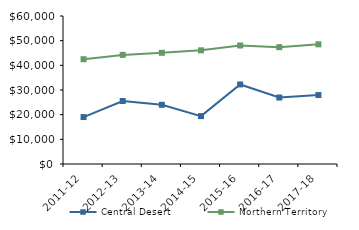
| Category | Central Desert | Northern Territory |
|---|---|---|
| 2011-12 | 19029.9 | 42481 |
| 2012-13 | 25538.62 | 44232.02 |
| 2013-14 | 23996.45 | 45075.51 |
| 2014-15 | 19419.52 | 46083.65 |
| 2015-16 | 32255 | 48046.27 |
| 2016-17 | 26949.76 | 47367.05 |
| 2017-18 | 27953.15 | 48519 |